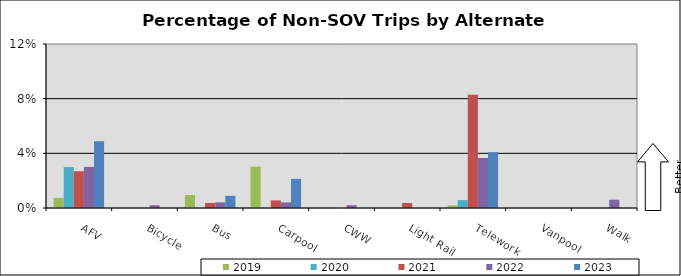
| Category | 2019 | 2020 | 2021 | 2022 | 2023 |
|---|---|---|---|---|---|
| AFV | 0.007 | 0.03 | 0.027 | 0.03 | 0.049 |
| Bicycle | 0 | 0 | 0 | 0.002 | 0 |
| Bus | 0.009 | 0 | 0.004 | 0.004 | 0.009 |
| Carpool | 0.03 | 0 | 0.006 | 0.004 | 0.021 |
| CWW | 0 | 0 | 0 | 0.002 | 0 |
| Light Rail | 0 | 0 | 0.004 | 0 | 0 |
| Telework | 0.002 | 0.006 | 0.083 | 0.037 | 0.041 |
| Vanpool | 0 | 0 | 0 | 0 | 0 |
| Walk | 0 | 0 | 0 | 0.006 | 0 |